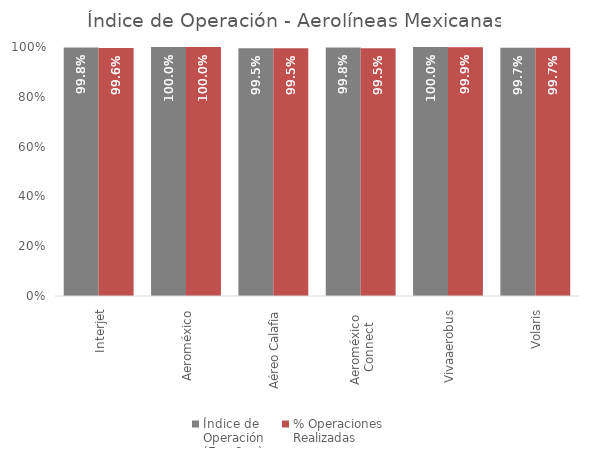
| Category | Índice de 
Operación
(Ene-Sep) | % Operaciones
Realizadas |
|---|---|---|
| Interjet | 0.998 | 0.996 |
| Aeroméxico | 1 | 1 |
| Aéreo Calafia | 0.995 | 0.995 |
| Aeroméxico 
Connect | 0.998 | 0.995 |
| Vivaaerobus | 1 | 0.999 |
| Volaris | 0.997 | 0.997 |